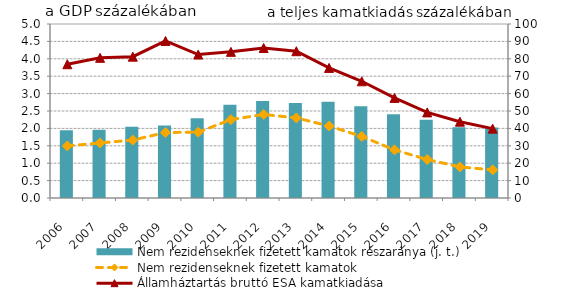
| Category | Nem rezidenseknek fizetett kamatok részaránya (j. t.) |
|---|---|
| 2006.0 | 38.911 |
| 2007.0 | 39.263 |
| 2008.0 | 40.993 |
| 2009.0 | 41.71 |
| 2010.0 | 45.894 |
| 2011.0 | 53.614 |
| 2012.0 | 55.728 |
| 2013.0 | 54.565 |
| 2014.0 | 55.363 |
| 2015.0 | 52.727 |
| 2016.0 | 48.085 |
| 2017.0 | 44.945 |
| 2018.0 | 40.731 |
| 2019.0 | 40.568 |